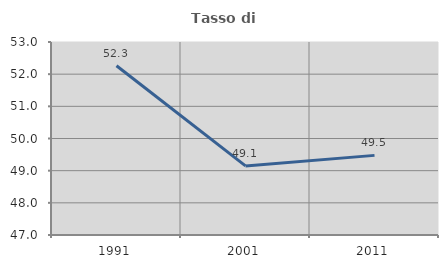
| Category | Tasso di occupazione   |
|---|---|
| 1991.0 | 52.26 |
| 2001.0 | 49.148 |
| 2011.0 | 49.475 |